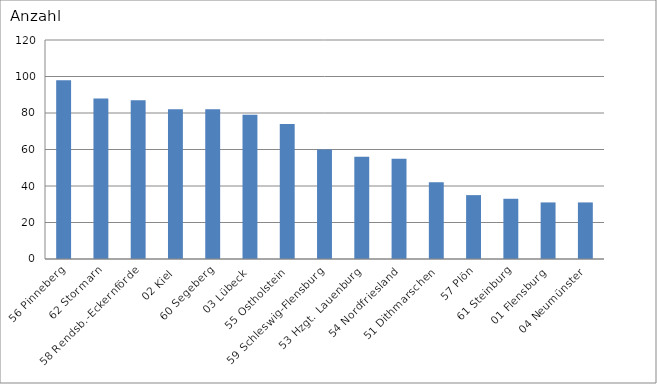
| Category | 56 Pinneberg 62 Stormarn 58 Rendsb.-Eckernförde 02 Kiel 60 Segeberg 03 Lübeck 55 Ostholstein 59 Schleswig-Flensburg 53 Hzgt. Lauenburg 54 Nordfriesland 51 Dithmarschen 57 Plön 61 Steinburg 01 Flensburg 04 Neumünster |
|---|---|
| 56 Pinneberg | 98 |
| 62 Stormarn | 88 |
| 58 Rendsb.-Eckernförde | 87 |
| 02 Kiel | 82 |
| 60 Segeberg | 82 |
| 03 Lübeck | 79 |
| 55 Ostholstein | 74 |
| 59 Schleswig-Flensburg | 60 |
| 53 Hzgt. Lauenburg | 56 |
| 54 Nordfriesland | 55 |
| 51 Dithmarschen | 42 |
| 57 Plön | 35 |
| 61 Steinburg | 33 |
| 01 Flensburg | 31 |
| 04 Neumünster | 31 |